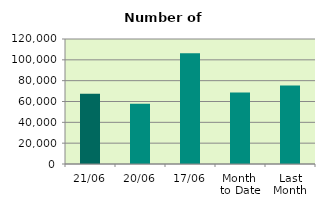
| Category | Series 0 |
|---|---|
| 21/06 | 67490 |
| 20/06 | 57746 |
| 17/06 | 106380 |
| Month 
to Date | 68588.4 |
| Last
Month | 75261.143 |